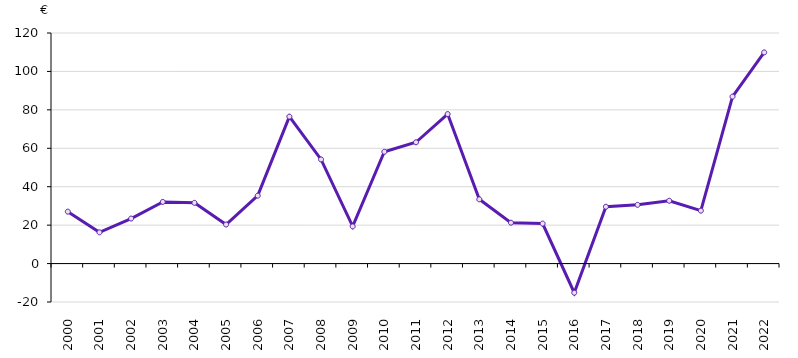
| Category | RCAI/ETP NS |
|---|---|
| 2000.0 | 27.02 |
| 2001.0 | 16.26 |
| 2002.0 | 23.44 |
| 2003.0 | 32.1 |
| 2004.0 | 31.61 |
| 2005.0 | 20.33 |
| 2006.0 | 35.34 |
| 2007.0 | 76.47 |
| 2008.0 | 54.2 |
| 2009.0 | 19.34 |
| 2010.0 | 58.19 |
| 2011.0 | 63.13 |
| 2012.0 | 77.8 |
| 2013.0 | 33.44 |
| 2014.0 | 21.27 |
| 2015.0 | 20.81 |
| 2016.0 | -15.18 |
| 2017.0 | 29.57 |
| 2018.0 | 30.564 |
| 2019.0 | 32.694 |
| 2020.0 | 27.533 |
| 2021.0 | 86.9 |
| 2022.0 | 109.9 |